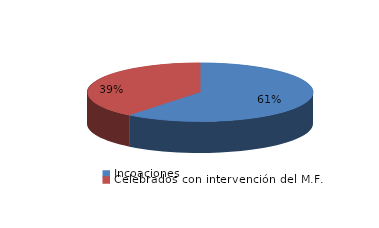
| Category | Series 0 |
|---|---|
| Incoaciones | 907 |
| Celebrados con intervención del M.F. | 588 |